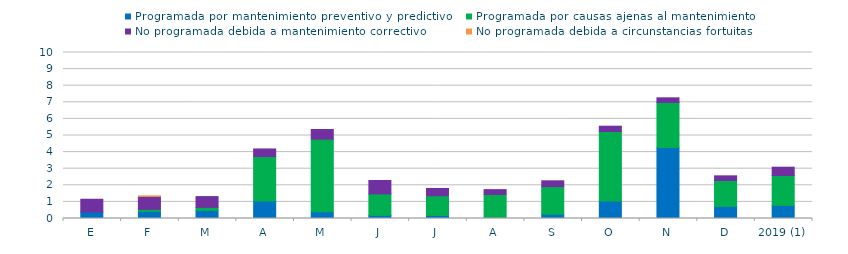
| Category | Programada por mantenimiento preventivo y predictivo | Programada por causas ajenas al mantenimiento  | No programada debida a mantenimiento correctivo  | No programada debida a circunstancias fortuitas  |
|---|---|---|---|---|
| E | 0.4 | 0 | 0.76 | 0 |
| F | 0.43 | 0.12 | 0.78 | 0.03 |
| M | 0.49 | 0.18 | 0.65 | 0 |
| A | 1.06 | 2.67 | 0.46 | 0 |
| M | 0.4 | 4.38 | 0.58 | 0 |
| J | 0.19 | 1.29 | 0.81 | 0 |
| J | 0.18 | 1.19 | 0.44 | 0 |
| A | 0.02 | 1.43 | 0.29 | 0 |
| S | 0.26 | 1.66 | 0.35 | 0 |
| O | 1.05 | 4.19 | 0.32 | 0 |
| N | 4.27 | 2.72 | 0.28 | 0 |
| D | 0.73 | 1.56 | 0.28 | 0 |
| 2019 (1) | 0.79 | 1.8 | 0.5 | 0 |